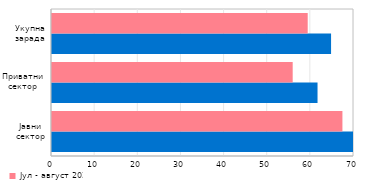
| Category | Јул - август 2021. | Јул - август 2020. |
|---|---|---|
| Јавни сектор | 72.189 | 67.318 |
| Приватни сектор | 61.546 | 55.79 |
| Укупна зарада | 64.685 | 59.271 |